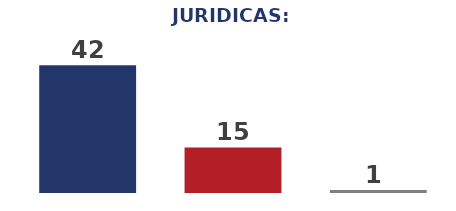
| Category | Series 0 |
|---|---|
| 0 | 42 |
| 1 | 15 |
| 2 | 1 |